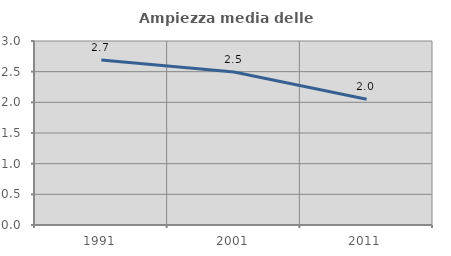
| Category | Ampiezza media delle famiglie |
|---|---|
| 1991.0 | 2.691 |
| 2001.0 | 2.495 |
| 2011.0 | 2.05 |